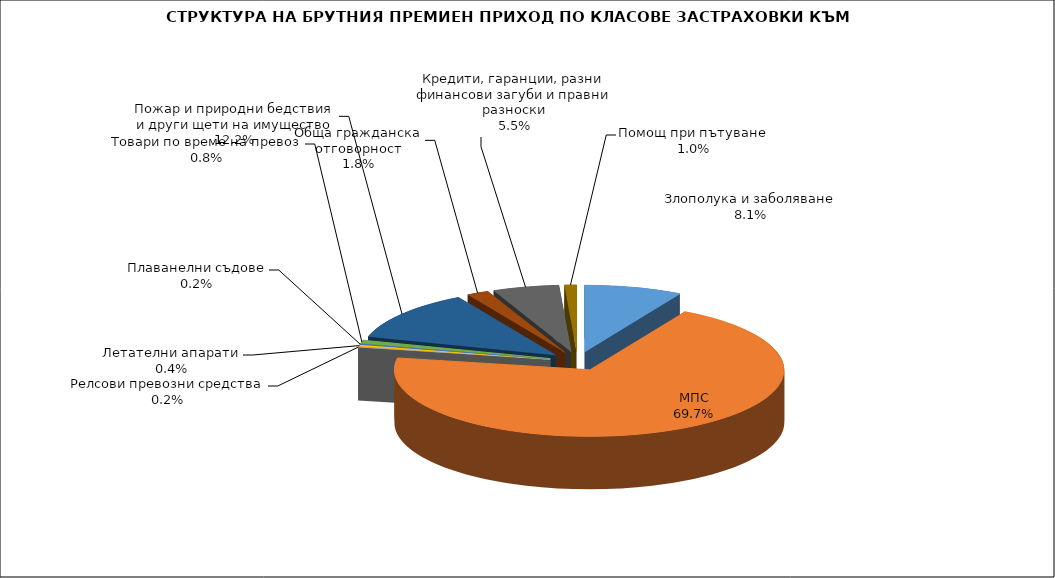
| Category | Злополука и заболяване |
|---|---|
| Злополука и заболяване | 0.081 |
| МПС | 0.697 |
| Релсови превозни средства | 0.002 |
| Летателни апарати | 0.004 |
| Плаванелни съдове | 0.002 |
| Товари по време на превоз | 0.008 |
| Пожар и природни бедствия и други щети на имущество | 0.122 |
| Обща гражданска отговорност | 0.018 |
| Кредити, гаранции, разни финансови загуби и правни разноски | 0.055 |
| Помощ при пътуване | 0.01 |